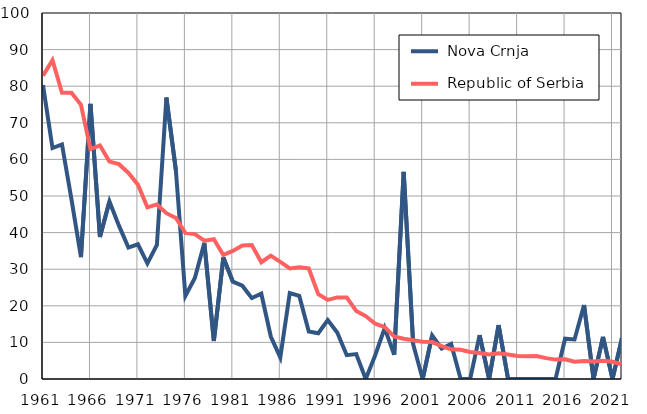
| Category |  Nova Crnja |  Republic of Serbia |
|---|---|---|
| 1961.0 | 80.3 | 82.9 |
| 1962.0 | 63.1 | 87.1 |
| 1963.0 | 64.1 | 78.2 |
| 1964.0 | 49.1 | 78.2 |
| 1965.0 | 33.3 | 74.9 |
| 1966.0 | 75.2 | 62.8 |
| 1967.0 | 38.8 | 63.8 |
| 1968.0 | 48.5 | 59.4 |
| 1969.0 | 41.9 | 58.7 |
| 1970.0 | 35.9 | 56.3 |
| 1971.0 | 36.8 | 53.1 |
| 1972.0 | 31.6 | 46.9 |
| 1973.0 | 36.6 | 47.7 |
| 1974.0 | 76.9 | 45.3 |
| 1975.0 | 57 | 44 |
| 1976.0 | 22.7 | 39.9 |
| 1977.0 | 27.6 | 39.6 |
| 1978.0 | 37.2 | 37.8 |
| 1979.0 | 10.4 | 38.2 |
| 1980.0 | 33.2 | 33.9 |
| 1981.0 | 26.6 | 35 |
| 1982.0 | 25.5 | 36.5 |
| 1983.0 | 22.1 | 36.6 |
| 1984.0 | 23.3 | 31.9 |
| 1985.0 | 11.6 | 33.7 |
| 1986.0 | 5.9 | 32 |
| 1987.0 | 23.5 | 30.2 |
| 1988.0 | 22.7 | 30.5 |
| 1989.0 | 13 | 30.2 |
| 1990.0 | 12.5 | 23.2 |
| 1991.0 | 16.1 | 21.6 |
| 1992.0 | 12.7 | 22.3 |
| 1993.0 | 6.5 | 22.3 |
| 1994.0 | 6.8 | 18.6 |
| 1995.0 | 0 | 17.2 |
| 1996.0 | 6.5 | 15.1 |
| 1997.0 | 13.9 | 14.2 |
| 1998.0 | 6.6 | 11.6 |
| 1999.0 | 56.6 | 11 |
| 2000.0 | 9.5 | 10.6 |
| 2001.0 | 0 | 10.2 |
| 2002.0 | 11.9 | 10.1 |
| 2003.0 | 8.3 | 9 |
| 2004.0 | 9.6 | 8.1 |
| 2005.0 | 0 | 8 |
| 2006.0 | 0 | 7.4 |
| 2007.0 | 12 | 7.1 |
| 2008.0 | 0 | 6.7 |
| 2009.0 | 14.7 | 7 |
| 2010.0 | 0 | 6.7 |
| 2011.0 | 0 | 6.3 |
| 2012.0 | 0 | 6.2 |
| 2013.0 | 0 | 6.3 |
| 2014.0 | 0 | 5.7 |
| 2015.0 | 0 | 5.3 |
| 2016.0 | 11 | 5.4 |
| 2017.0 | 10.8 | 4.7 |
| 2018.0 | 20.2 | 4.9 |
| 2019.0 | 0 | 4.8 |
| 2020.0 | 11.5 | 5 |
| 2021.0 | 0 | 4.7 |
| 2022.0 | 11.2 | 4 |